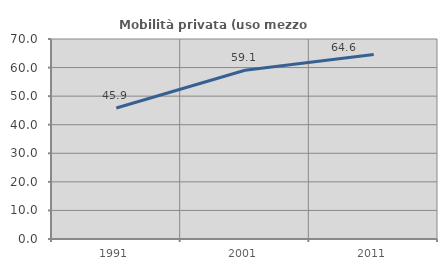
| Category | Mobilità privata (uso mezzo privato) |
|---|---|
| 1991.0 | 45.872 |
| 2001.0 | 59.06 |
| 2011.0 | 64.608 |